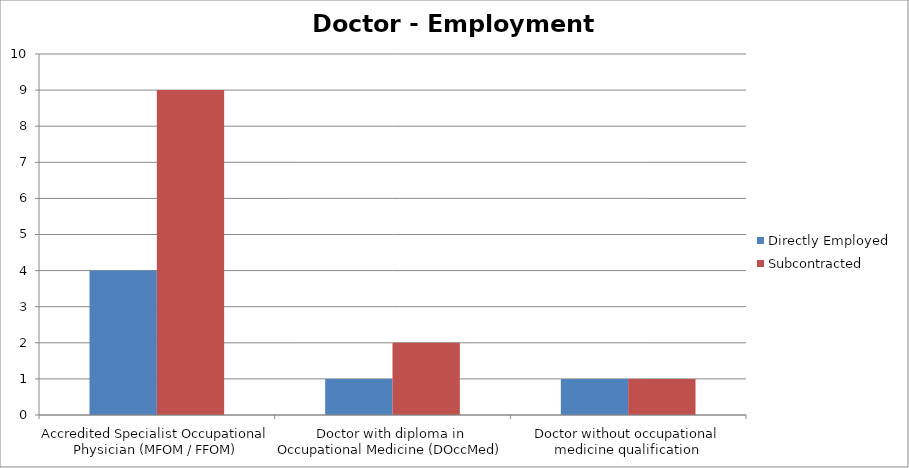
| Category | Directly Employed | Subcontracted |
|---|---|---|
| Accredited Specialist Occupational Physician (MFOM / FFOM) | 4 | 9 |
| Doctor with diploma in Occupational Medicine (DOccMed) | 1 | 2 |
| Doctor without occupational medicine qualification | 1 | 1 |